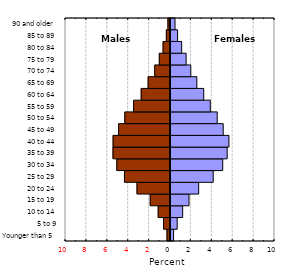
| Category | Series 0 |
|---|---|
| Younger than 5 | 0.297 |
| 5 to 9 | 0.641 |
| 10 to 14 | 1.164 |
| 15 to 19 | 1.772 |
| 20 to 24 | 2.696 |
| 25 to 29 | 4.089 |
| 30 to 34 | 4.999 |
| 35 to 39 | 5.423 |
| 40 to 44 | 5.593 |
| 45 to 49 | 5.044 |
| 50 to 54 | 4.468 |
| 55 to 59 | 3.807 |
| 60 to 64 | 3.178 |
| 65 to 69 | 2.522 |
| 70 to 74 | 1.942 |
| 75 to 79 | 1.497 |
| 80 to 84 | 1.068 |
| 85 to 89 | 0.679 |
| 90 and older | 0.432 |